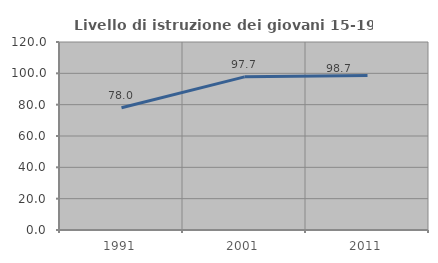
| Category | Livello di istruzione dei giovani 15-19 anni |
|---|---|
| 1991.0 | 78 |
| 2001.0 | 97.74 |
| 2011.0 | 98.684 |